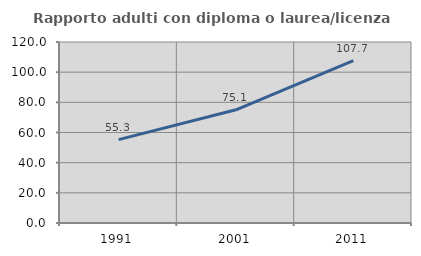
| Category | Rapporto adulti con diploma o laurea/licenza media  |
|---|---|
| 1991.0 | 55.275 |
| 2001.0 | 75.052 |
| 2011.0 | 107.657 |